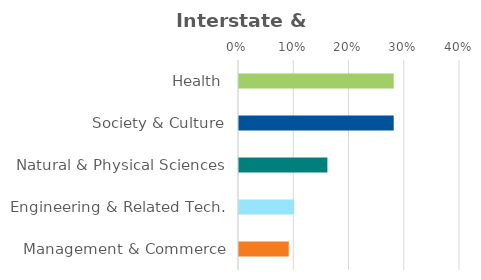
| Category | Series 0 |
|---|---|
| Health | 0.28 |
| Society & Culture | 0.28 |
| Natural & Physical Sciences | 0.16 |
| Engineering & Related Tech. | 0.1 |
| Management & Commerce | 0.09 |